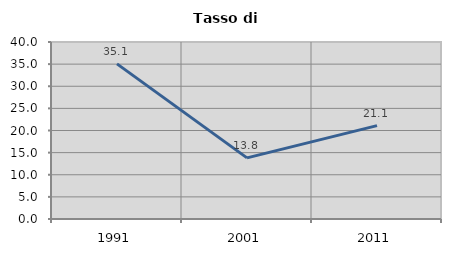
| Category | Tasso di disoccupazione   |
|---|---|
| 1991.0 | 35.051 |
| 2001.0 | 13.814 |
| 2011.0 | 21.107 |